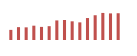
| Category | Importações (2) |
|---|---|
| 0 | 63256.661 |
| 1 | 80362.628 |
| 2 | 79098.748 |
| 3 | 89493.365 |
| 4 | 81914.569 |
| 5 | 86371.3 |
| 6 | 122399.001 |
| 7 | 125153.991 |
| 8 | 116754.909 |
| 9 | 110190.536 |
| 10 | 137205.926 |
| 11 | 154727.051 |
| 12 | 169208.338 |
| 13 | 166254.713 |
| 14 | 167267.075 |